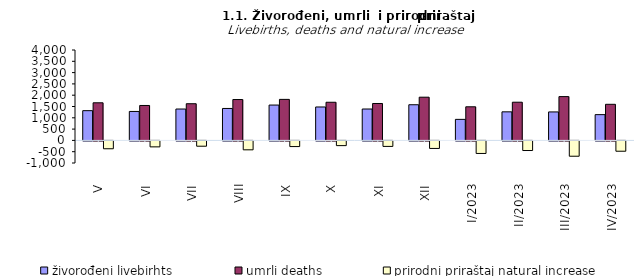
| Category | živorođeni livebirhts | umrli deaths | prirodni priraštaj natural increase |
|---|---|---|---|
| V | 1316 | 1664 | -348 |
| VI | 1281 | 1545 | -264 |
| VII | 1388 | 1623 | -235 |
| VIII | 1413 | 1808 | -395 |
| IX | 1564 | 1815 | -251 |
| X | 1479 | 1688 | -209 |
| XI | 1389 | 1633 | -244 |
| XII | 1578 | 1912 | -334 |
| I/2023 | 931 | 1487 | -556 |
| II/2023 | 1264 | 1690 | -426 |
| III/2023 | 1260 | 1938 | -678 |
| IV/2023 | 1140 | 1597 | -457 |